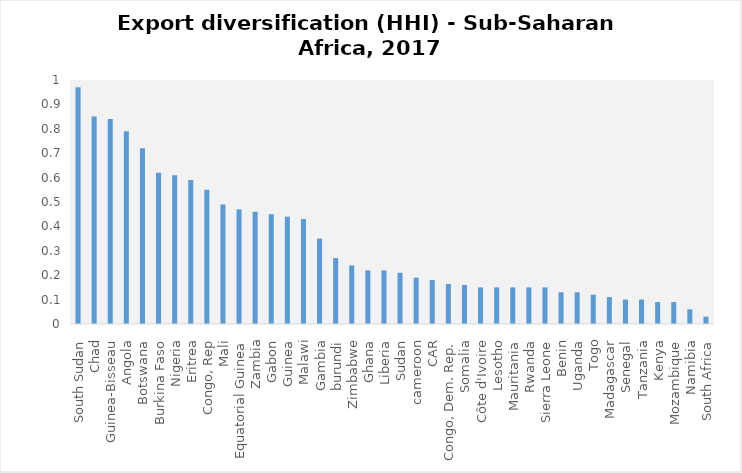
| Category | Series 0 |
|---|---|
| South Sudan | 0.97 |
| Chad | 0.85 |
| Guinea-Bisseau | 0.84 |
| Angola | 0.79 |
| Botswana | 0.72 |
| Burkina Faso | 0.62 |
| Nigeria | 0.61 |
| Eritrea | 0.59 |
| Congo, Rep | 0.55 |
| Mali | 0.49 |
| Equatorial Guinea | 0.47 |
| Zambia | 0.46 |
| Gabon | 0.45 |
| Guinea | 0.44 |
| Malawi | 0.43 |
| Gambia | 0.35 |
| burundi | 0.27 |
| Zimbabwe | 0.24 |
| Ghana | 0.22 |
| Liberia | 0.22 |
| Sudan | 0.21 |
| cameroon | 0.19 |
| CAR | 0.18 |
| Congo, Dem. Rep. | 0.164 |
| Somalia | 0.16 |
| Côte d'Ivoire | 0.15 |
| Lesotho | 0.15 |
| Mauritania | 0.15 |
| Rwanda | 0.15 |
| Sierra Leone | 0.15 |
| Benin | 0.13 |
| Uganda | 0.13 |
| Togo | 0.12 |
| Madagascar | 0.11 |
| Senegal | 0.1 |
| Tanzania | 0.1 |
| Kenya | 0.09 |
| Mozambique | 0.09 |
| Namibia | 0.06 |
| South Africa | 0.03 |